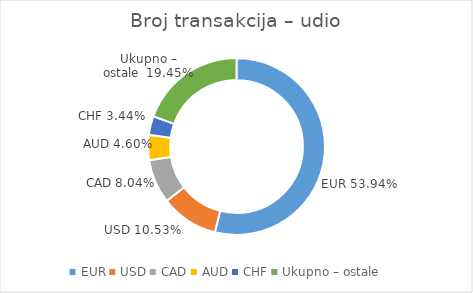
| Category | Broj transakcija – udio |
|---|---|
| EUR | 0.539 |
| USD | 0.105 |
| CAD | 0.08 |
| AUD | 0.046 |
| CHF | 0.034 |
| Ukupno – ostale  | 0.194 |